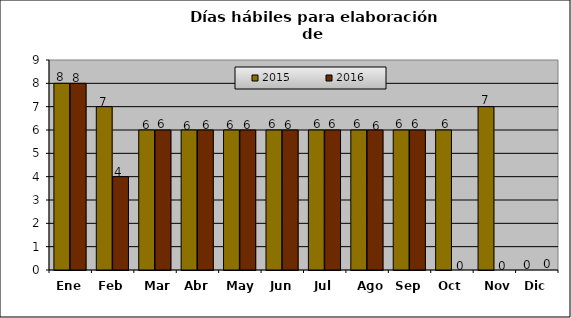
| Category | 2015 | 2016 |
|---|---|---|
| Ene | 8 | 8 |
| Feb | 7 | 4 |
| Mar | 6 | 6 |
| Abr | 6 | 6 |
| May | 6 | 6 |
| Jun | 6 | 6 |
| Jul | 6 | 6 |
| Ago | 6 | 6 |
| Sep | 6 | 6 |
| Oct | 6 | 0 |
| Nov | 7 | 0 |
| Dic | 0 | 0 |